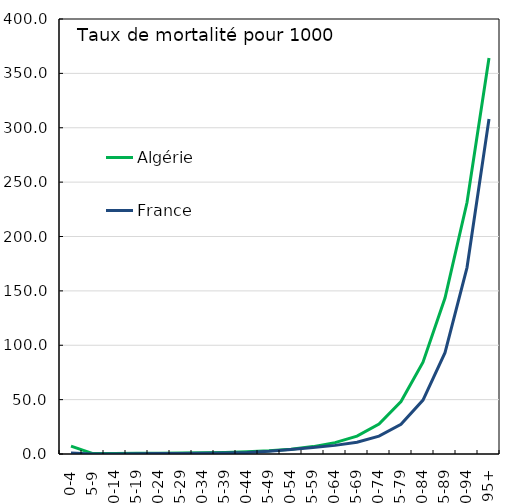
| Category | Algérie | France |
|---|---|---|
| 0-4 | 7.189 | 0.814 |
| 5-9 | 0.396 | 0.068 |
| 10-14 | 0.458 | 0.105 |
| 15-19 | 0.61 | 0.257 |
| 20-24 | 0.801 | 0.442 |
| 25-29 | 0.94 | 0.519 |
| 30-34 | 1.129 | 0.626 |
| 35-39 | 1.474 | 0.917 |
| 40-44 | 2.042 | 1.489 |
| 45-49 | 2.959 | 2.525 |
| 50-54 | 4.402 | 4.09 |
| 55-59 | 6.792 | 5.922 |
| 60-64 | 10.463 | 7.935 |
| 65-69 | 16.454 | 10.811 |
| 70-74 | 27.482 | 16.379 |
| 75-79 | 48.23 | 27.297 |
| 80-84 | 84.378 | 49.617 |
| 85-89 | 143.38 | 93.152 |
| 90-94 | 231.265 | 171.409 |
| 95+ | 364.1 | 308.108 |